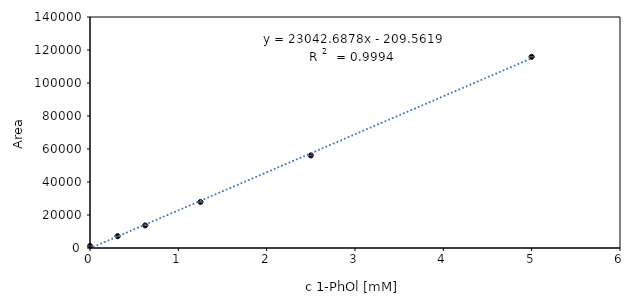
| Category | Series 0 |
|---|---|
| 5.0 | 115871.667 |
| 2.5 | 56099 |
| 1.25 | 27923 |
| 0.625 | 13709.333 |
| 0.3125 | 7140.667 |
| 0.0 | 1225 |